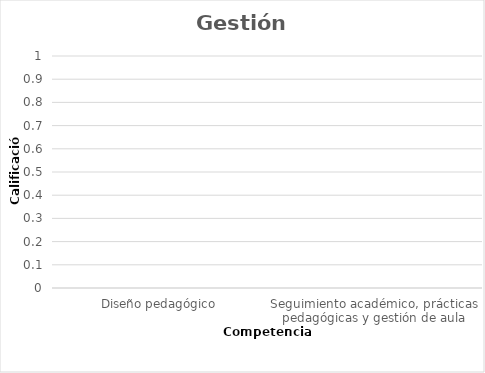
| Category | Series 0 |
|---|---|
| Diseño pedagógico | 0 |
| Seguimiento académico, prácticas pedagógicas y gestión de aula | 0 |